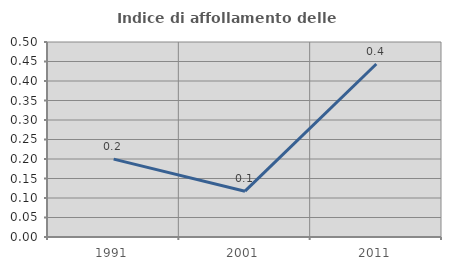
| Category | Indice di affollamento delle abitazioni  |
|---|---|
| 1991.0 | 0.2 |
| 2001.0 | 0.118 |
| 2011.0 | 0.444 |